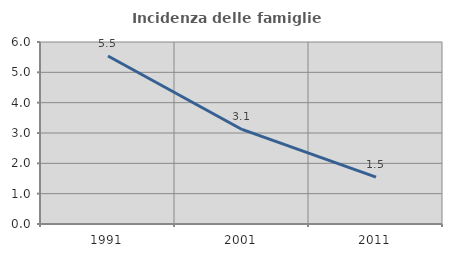
| Category | Incidenza delle famiglie numerose |
|---|---|
| 1991.0 | 5.538 |
| 2001.0 | 3.117 |
| 2011.0 | 1.544 |